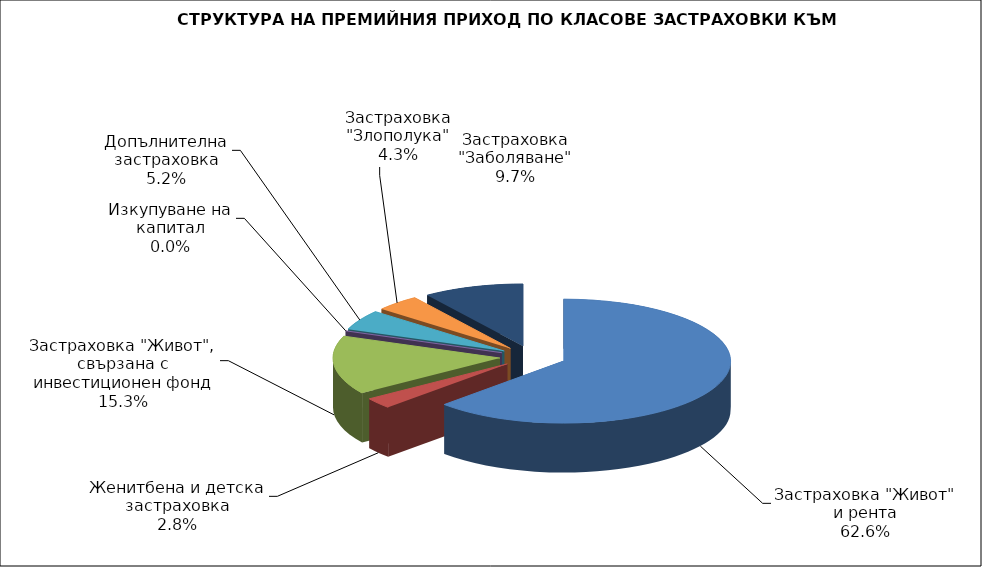
| Category | Series 0 |
|---|---|
| Застраховка "Живот" и рента | 29354342.452 |
| Женитбена и детска застраховка | 1321500.641 |
| Застраховка "Живот", свързана с инвестиционен фонд | 7164498.948 |
| Изкупуване на капитал | 0 |
| Допълнителна застраховка | 2447778.61 |
| Застраховка "Злополука" | 2016570.22 |
| Застраховка "Заболяване" | 4553978.15 |